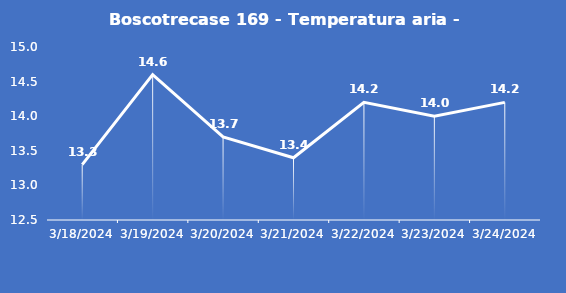
| Category | Boscotrecase 169 - Temperatura aria - Grezzo (°C) |
|---|---|
| 3/18/24 | 13.3 |
| 3/19/24 | 14.6 |
| 3/20/24 | 13.7 |
| 3/21/24 | 13.4 |
| 3/22/24 | 14.2 |
| 3/23/24 | 14 |
| 3/24/24 | 14.2 |